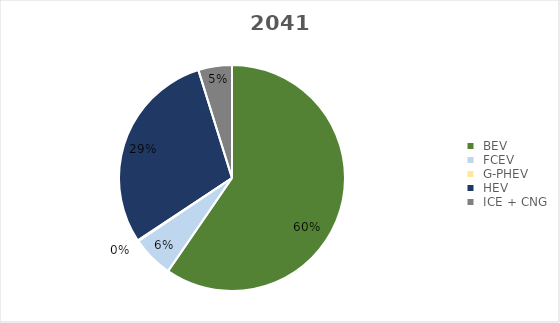
| Category | 2041 |
|---|---|
|  BEV  | 268359 |
|  FCEV  | 27002 |
|  G-PHEV  | 535 |
|  HEV  | 132945 |
|  ICE + CNG  | 21667 |